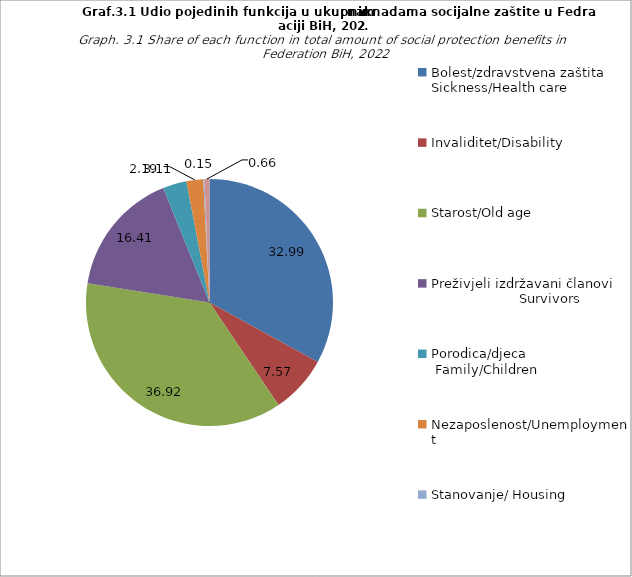
| Category | Series 0 |
|---|---|
| Bolest/zdravstvena zaštita  Sickness/Health care | 32.99 |
| Invaliditet/Disability | 7.57 |
| Starost/Old age | 36.92 |
| Preživjeli izdržavani članovi                           Survivors | 16.41 |
| Porodica/djeca                           Family/Children | 3.11 |
| Nezaposlenost/Unemployment | 2.19 |
| Stanovanje/ Housing | 0.15 |
| Socijalna isključenost koja nije drugdje kvalifikovana                                   Social exclusion not elsewhere  classified | 0.66 |